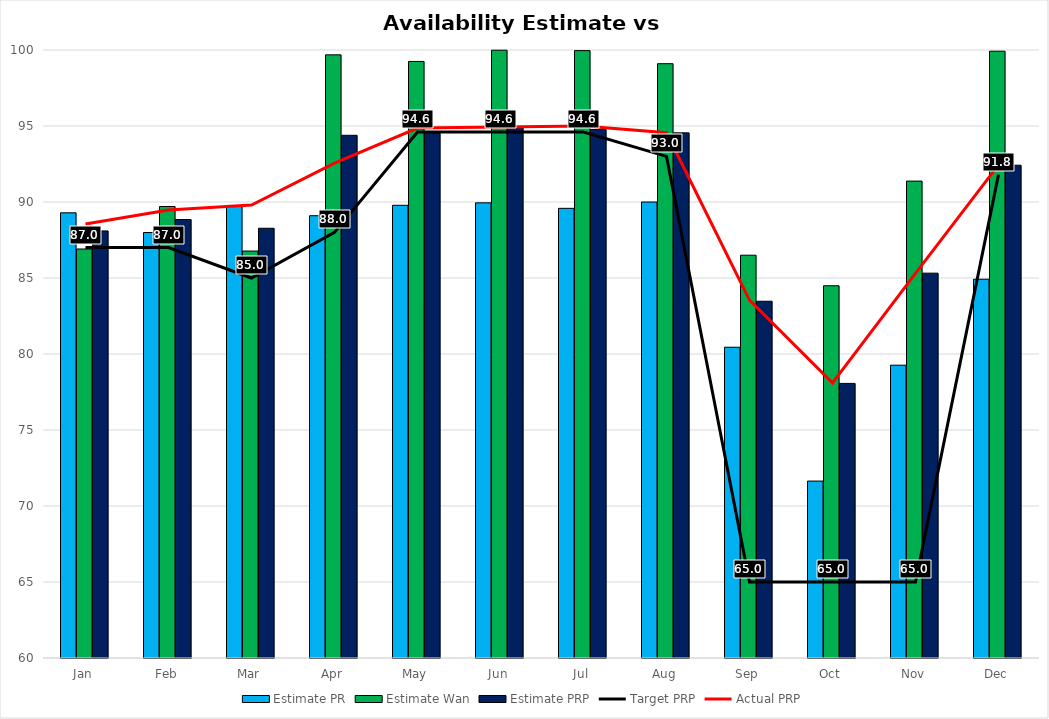
| Category | Estimate PR | Estimate Wan | Estimate PRP |
|---|---|---|---|
| Jan | 89.288 | 86.909 | 88.098 |
| Feb | 87.991 | 89.702 | 88.847 |
| Mar | 89.772 | 86.774 | 88.273 |
| Apr | 89.097 | 99.681 | 94.389 |
| May | 89.785 | 99.247 | 94.516 |
| Jun | 89.944 | 99.986 | 94.965 |
| Jul | 89.583 | 99.96 | 94.772 |
| Aug | 90 | 99.099 | 94.55 |
| Sep | 80.444 | 86.5 | 83.472 |
| Oct | 71.64 | 84.489 | 78.065 |
| Nov | 79.264 | 91.375 | 85.319 |
| Dec | 84.919 | 99.919 | 92.419 |